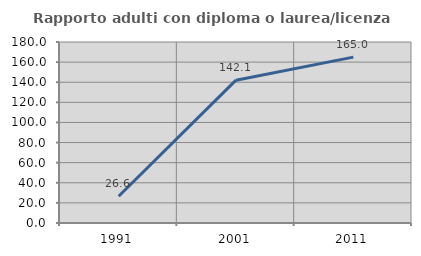
| Category | Rapporto adulti con diploma o laurea/licenza media  |
|---|---|
| 1991.0 | 26.562 |
| 2001.0 | 142.056 |
| 2011.0 | 164.957 |